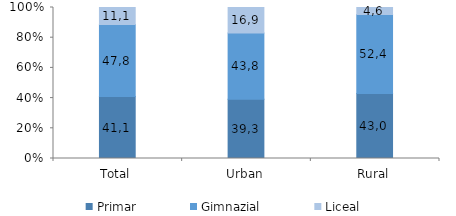
| Category | Primar | Gimnazial | Liceal |
|---|---|---|---|
| Total | 41 | 47.8 | 11.2 |
| Urban | 39.2 | 43.9 | 16.9 |
| Rural | 43 | 52.4 | 4.6 |